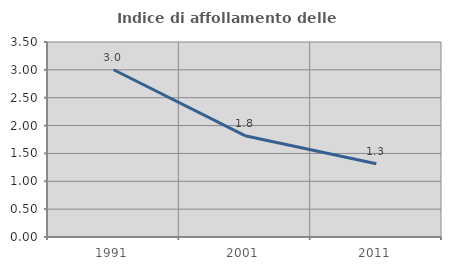
| Category | Indice di affollamento delle abitazioni  |
|---|---|
| 1991.0 | 3.002 |
| 2001.0 | 1.818 |
| 2011.0 | 1.316 |